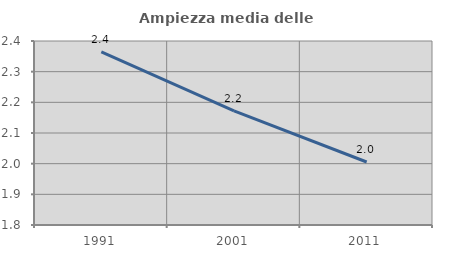
| Category | Ampiezza media delle famiglie |
|---|---|
| 1991.0 | 2.364 |
| 2001.0 | 2.172 |
| 2011.0 | 2.005 |